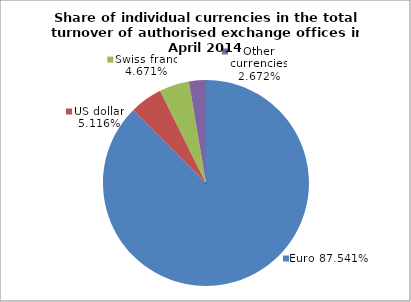
| Category | EUR |
|---|---|
| 0 | 0.875 |
| 1 | 0.051 |
| 2 | 0.047 |
| 3 | 0.027 |